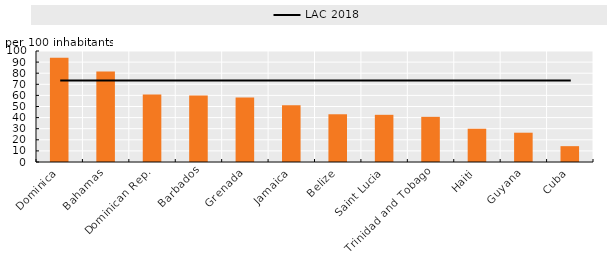
| Category | Dominica |
|---|---|
| Dominica | 93.909 |
| Bahamas | 81.532 |
| Dominican Rep. | 60.822 |
| Barbados | 59.937 |
| Grenada | 58.042 |
| Jamaica | 51.189 |
| Belize | 43.002 |
| Saint Lucia | 42.511 |
| Trinidad and Tobago | 40.682 |
| Haiti | 29.983 |
| Guyana | 26.385 |
| Cuba | 14.274 |